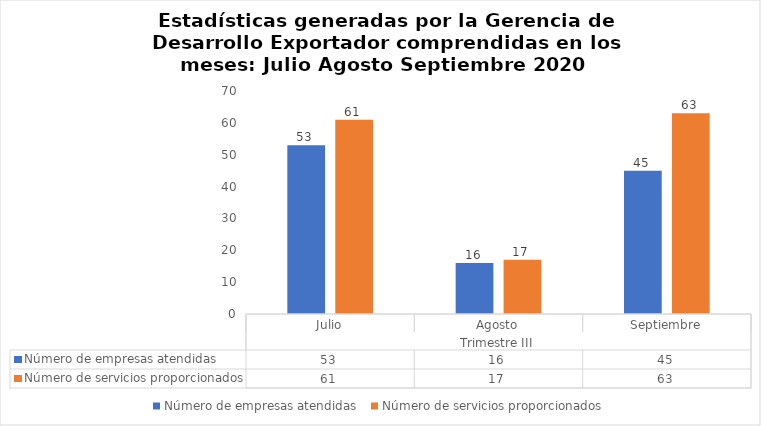
| Category | Número de empresas atendidas  | Número de servicios proporcionados |
|---|---|---|
| 0 | 53 | 61 |
| 1 | 16 | 17 |
| 2 | 45 | 63 |